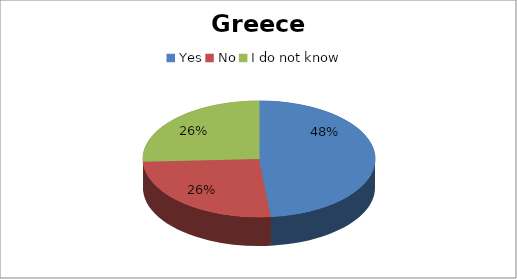
| Category | Series 0 |
|---|---|
| Yes | 30 |
| No | 16 |
| I do not know | 16 |